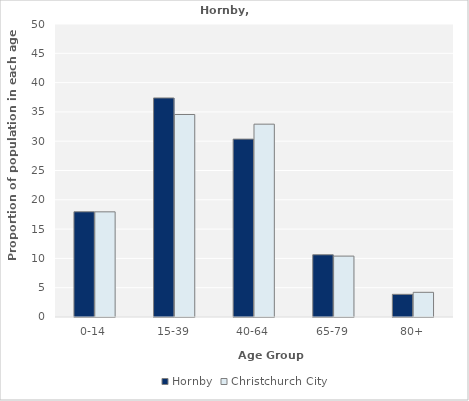
| Category | Hornby | Christchurch City |
|---|---|---|
| 0-14 | 17.956 | 17.945 |
| 15-39 | 37.378 | 34.556 |
| 40-64 | 30.356 | 32.907 |
| 65-79 | 10.622 | 10.392 |
| 80+ | 3.867 | 4.211 |